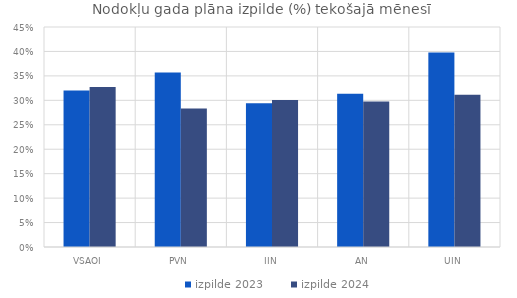
| Category | izpilde 2023 | izpilde 2024 |
|---|---|---|
| VSAOI | 0.32 | 0.327 |
| PVN | 0.357 | 0.283 |
| IIN | 0.294 | 0.301 |
| AN | 0.313 | 0.297 |
| UIN | 0.398 | 0.311 |